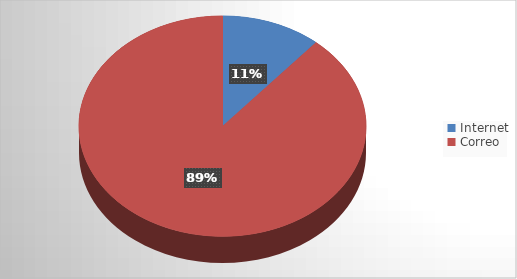
| Category | Series 0 |
|---|---|
| Internet | 9 |
| Correo | 71 |